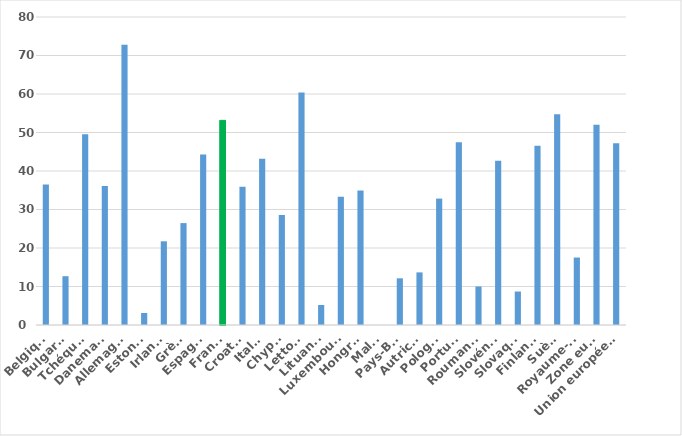
| Category | Series 0 |
|---|---|
| Belgique | 36.515 |
| Bulgarie | 12.676 |
| Tchéquie | 49.533 |
| Danemark | 36.095 |
| Allemagne | 72.778 |
| Estonie | 3.125 |
| Irlande | 21.739 |
| Grèce | 26.471 |
| Espagne | 44.271 |
| France | 53.153 |
| Croatie | 35.897 |
| Italie | 43.165 |
| Chypre | 28.571 |
| Lettonie | 60.396 |
| Lituanie | 5.195 |
| Luxembourg | 33.333 |
| Hongrie | 34.921 |
| Malte | 0 |
| Pays-Bas | 12.121 |
| Autriche | 13.665 |
| Pologne | 32.836 |
| Portugal | 47.458 |
| Roumanie | 10 |
| Slovénie | 42.683 |
| Slovaquie | 8.696 |
| Finlande | 46.575 |
| Suède | 54.762 |
| Royaume-Uni | 17.526 |
| Zone euro | 52.027 |
| Union européenne | 47.222 |